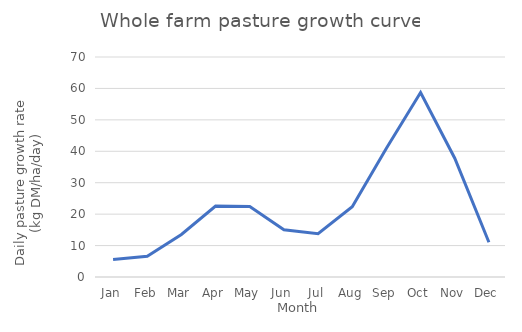
| Category | Series 0 |
|---|---|
| Jan | 5.581 |
| Feb | 6.587 |
| Mar | 13.523 |
| Apr | 22.551 |
| May | 22.442 |
| Jun | 15.008 |
| Jul | 13.752 |
| Aug | 22.35 |
| Sep | 40.974 |
| Oct | 58.677 |
| Nov | 37.8 |
| Dec | 11.068 |